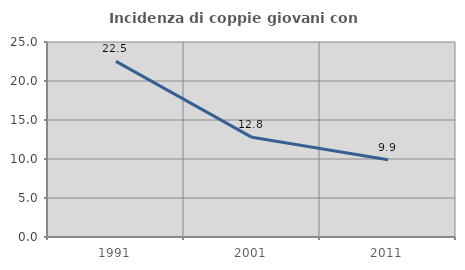
| Category | Incidenza di coppie giovani con figli |
|---|---|
| 1991.0 | 22.508 |
| 2001.0 | 12.779 |
| 2011.0 | 9.903 |